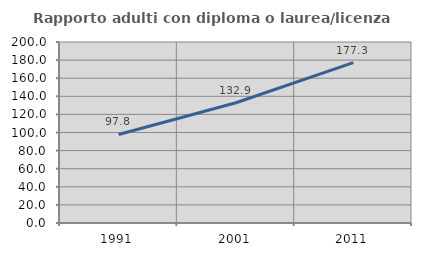
| Category | Rapporto adulti con diploma o laurea/licenza media  |
|---|---|
| 1991.0 | 97.826 |
| 2001.0 | 132.857 |
| 2011.0 | 177.273 |